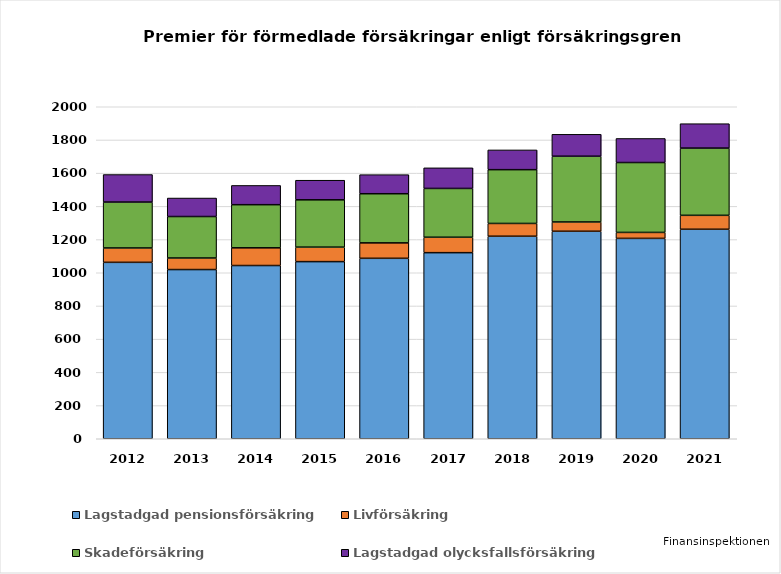
| Category | Lagstadgad pensionsförsäkring | Livförsäkring | Skadeförsäkring | Lagstadgad olycksfallsförsäkring |
|---|---|---|---|---|
| 2012.0 | 1062.705 | 86.597 | 276.62 | 165.706 |
| 2013.0 | 1019.216 | 69.648 | 249.823 | 111.515 |
| 2014.0 | 1043.573 | 106.619 | 259.835 | 115.957 |
| 2015.0 | 1067.062 | 87.285 | 284.943 | 118.153 |
| 2016.0 | 1087 | 93 | 296 | 115 |
| 2017.0 | 1121 | 93 | 294 | 124 |
| 2018.0 | 1220 | 77 | 324 | 119 |
| 2019.0 | 1250 | 56 | 396 | 132 |
| 2020.0 | 1207 | 36 | 421 | 145 |
| 2021.0 | 1262 | 84 | 405 | 147 |